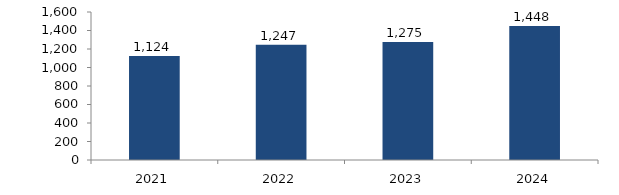
| Category | Bogotá |
|---|---|
| 2021.0 | 1123.531 |
| 2022.0 | 1246.883 |
| 2023.0 | 1275.152 |
| 2024.0 | 1447.844 |